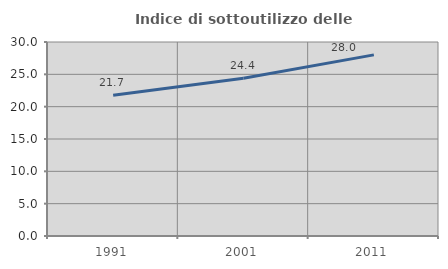
| Category | Indice di sottoutilizzo delle abitazioni  |
|---|---|
| 1991.0 | 21.749 |
| 2001.0 | 24.379 |
| 2011.0 | 28.008 |